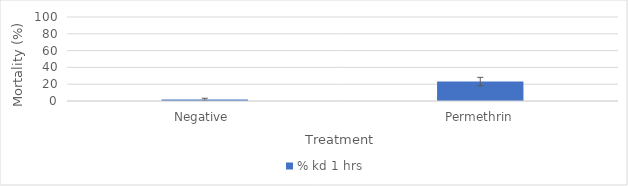
| Category | % kd 1 hrs |
|---|---|
| Negative  | 1.887 |
| Permethrin | 23.077 |